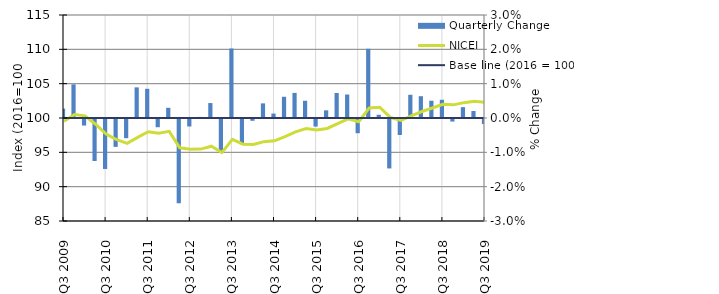
| Category | Quarterly Change |
|---|---|
| Q3 2009 | 0.003 |
|  | 0.01 |
|  | -0.002 |
|  | -0.012 |
| Q3 2010 | -0.015 |
|  | -0.008 |
|  | -0.006 |
|  | 0.009 |
| Q3 2011 | 0.009 |
|  | -0.002 |
|  | 0.003 |
|  | -0.025 |
| Q3 2012 | -0.002 |
|  | 0 |
|  | 0.004 |
|  | -0.01 |
| Q3 2013 | 0.02 |
|  | -0.007 |
|  | -0.001 |
|  | 0.004 |
| Q3 2014 | 0.001 |
|  | 0.006 |
|  | 0.007 |
|  | 0.005 |
| Q3 2015 | -0.002 |
|  | 0.002 |
|  | 0.007 |
|  | 0.007 |
| Q3 2016 | -0.004 |
|  | 0.02 |
|  | 0.001 |
|  | -0.014 |
| Q3 2017 | -0.005 |
|  | 0.007 |
|  | 0.006 |
|  | 0.005 |
| Q3 2018 | 0.005 |
|  | -0.001 |
|  | 0.003 |
|  | 0.002 |
| Q3 2019 | -0.001 |